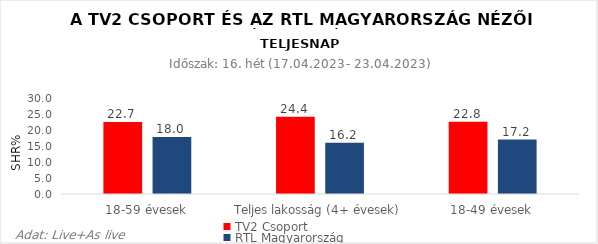
| Category | TV2 Csoport | RTL Magyarország |
|---|---|---|
| 18-59 évesek | 22.7 | 18 |
| Teljes lakosság (4+ évesek) | 24.4 | 16.2 |
| 18-49 évesek | 22.8 | 17.2 |